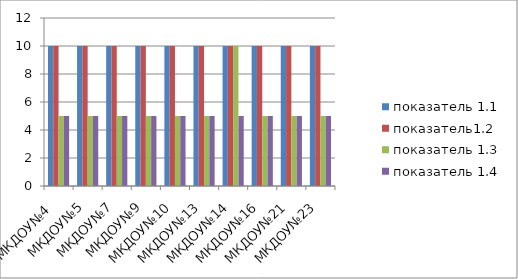
| Category | показатель 1.1 | показатель1.2 | показатель 1.3 | показатель 1.4 |
|---|---|---|---|---|
| МКДОУ№4  | 10 | 10 | 5 | 5 |
| МКДОУ№5 | 10 | 10 | 5 | 5 |
| МКДОУ№7 | 10 | 10 | 5 | 5 |
| МКДОУ№9 | 10 | 10 | 5 | 5 |
| МКДОУ№10 | 10 | 10 | 5 | 5 |
| МКДОУ№13 | 10 | 10 | 5 | 5 |
| МКДОУ№14 | 10 | 10 | 10 | 5 |
| МКДОУ№16 | 10 | 10 | 5 | 5 |
| МКДОУ№21 | 10 | 10 | 5 | 5 |
| МКДОУ№23 | 10 | 10 | 5 | 5 |